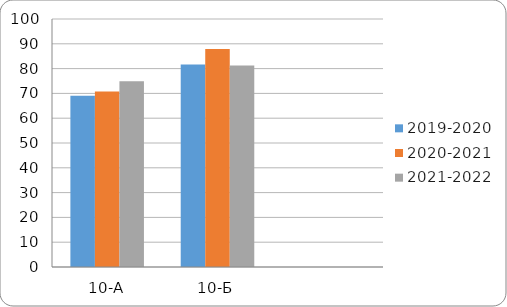
| Category | 2019-2020 | 2020-2021 | 2021-2022 |
|---|---|---|---|
| 10-А | 69.1 | 70.8 | 74.9 |
| 10-Б | 81.7 | 87.9 | 81.2 |